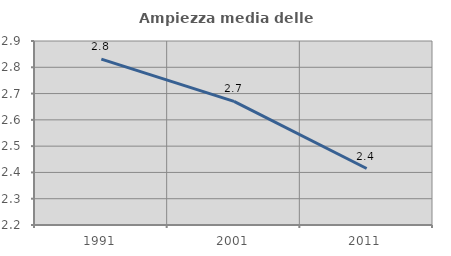
| Category | Ampiezza media delle famiglie |
|---|---|
| 1991.0 | 2.831 |
| 2001.0 | 2.67 |
| 2011.0 | 2.415 |